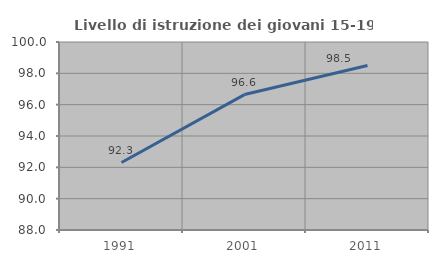
| Category | Livello di istruzione dei giovani 15-19 anni |
|---|---|
| 1991.0 | 92.308 |
| 2001.0 | 96.644 |
| 2011.0 | 98.496 |